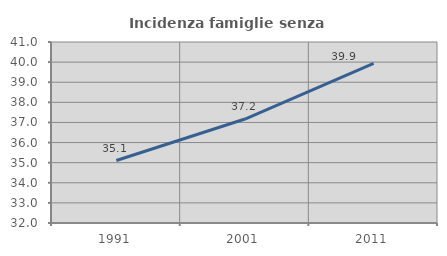
| Category | Incidenza famiglie senza nuclei |
|---|---|
| 1991.0 | 35.106 |
| 2001.0 | 37.171 |
| 2011.0 | 39.933 |